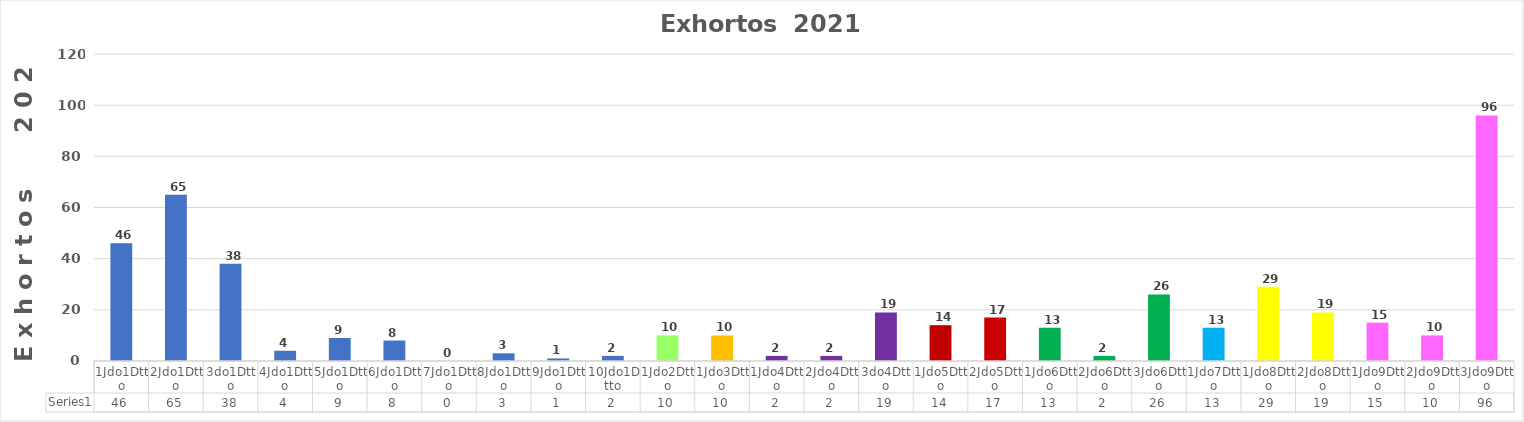
| Category | Series 0 |
|---|---|
| 1Jdo1Dtto | 46 |
| 2Jdo1Dtto | 65 |
| 3do1Dtto | 38 |
| 4Jdo1Dtto | 4 |
| 5Jdo1Dtto | 9 |
| 6Jdo1Dtto | 8 |
| 7Jdo1Dtto | 0 |
| 8Jdo1Dtto | 3 |
| 9Jdo1Dtto | 1 |
| 10Jdo1Dtto | 2 |
| 1Jdo2Dtto | 10 |
| 1Jdo3Dtto | 10 |
| 1Jdo4Dtto | 2 |
| 2Jdo4Dtto | 2 |
| 3do4Dtto | 19 |
| 1Jdo5Dtto | 14 |
| 2Jdo5Dtto | 17 |
| 1Jdo6Dtto | 13 |
| 2Jdo6Dtto | 2 |
| 3Jdo6Dtto | 26 |
| 1Jdo7Dtto | 13 |
| 1Jdo8Dtto | 29 |
| 2Jdo8Dtto | 19 |
| 1Jdo9Dtto | 15 |
| 2Jdo9Dtto | 10 |
| 3Jdo9Dtto | 96 |